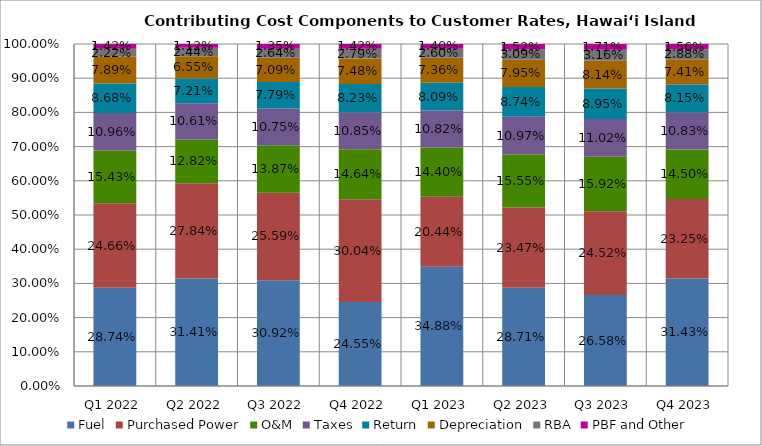
| Category | Fuel | Purchased Power | O&M | Taxes | Return | Depreciation | RBA | PBF and Other |
|---|---|---|---|---|---|---|---|---|
| Q1 2022 | 0.287 | 0.247 | 0.154 | 0.11 | 0.087 | 0.079 | 0.022 | 0.014 |
| Q2 2022 | 0.314 | 0.278 | 0.128 | 0.106 | 0.072 | 0.066 | 0.024 | 0.011 |
| Q3 2022 | 0.309 | 0.256 | 0.139 | 0.107 | 0.078 | 0.071 | 0.026 | 0.014 |
| Q4 2022 | 0.245 | 0.3 | 0.146 | 0.108 | 0.082 | 0.075 | 0.028 | 0.014 |
| Q1 2023 | 0.349 | 0.204 | 0.144 | 0.108 | 0.081 | 0.074 | 0.026 | 0.014 |
| Q2 2023 | 0.287 | 0.235 | 0.156 | 0.11 | 0.087 | 0.08 | 0.031 | 0.015 |
| Q3 2023 | 0.266 | 0.245 | 0.159 | 0.11 | 0.089 | 0.081 | 0.032 | 0.017 |
| Q4 2023 | 0.314 | 0.232 | 0.145 | 0.108 | 0.082 | 0.074 | 0.029 | 0.016 |